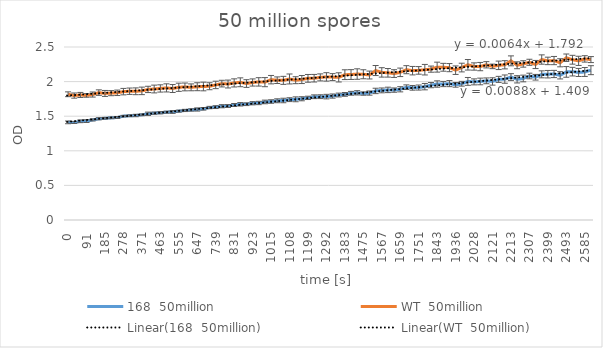
| Category | 168  50million | WT  50million |
|---|---|---|
| 0.0 | 1.411 | 1.817 |
| 30.0 | 1.41 | 1.798 |
| 61.0 | 1.426 | 1.807 |
| 91.0 | 1.429 | 1.8 |
| 122.0 | 1.446 | 1.813 |
| 153.0 | 1.463 | 1.841 |
| 185.0 | 1.47 | 1.829 |
| 216.0 | 1.476 | 1.833 |
| 246.0 | 1.481 | 1.838 |
| 278.0 | 1.501 | 1.855 |
| 309.0 | 1.506 | 1.861 |
| 341.0 | 1.51 | 1.86 |
| 371.0 | 1.52 | 1.866 |
| 402.0 | 1.535 | 1.887 |
| 432.0 | 1.544 | 1.893 |
| 463.0 | 1.55 | 1.901 |
| 494.0 | 1.558 | 1.909 |
| 525.0 | 1.561 | 1.9 |
| 555.0 | 1.573 | 1.918 |
| 586.0 | 1.583 | 1.923 |
| 617.0 | 1.59 | 1.917 |
| 647.0 | 1.597 | 1.926 |
| 678.0 | 1.607 | 1.929 |
| 708.0 | 1.625 | 1.933 |
| 739.0 | 1.631 | 1.952 |
| 770.0 | 1.644 | 1.971 |
| 800.0 | 1.647 | 1.965 |
| 831.0 | 1.662 | 1.981 |
| 862.0 | 1.672 | 1.99 |
| 893.0 | 1.673 | 1.972 |
| 923.0 | 1.687 | 1.987 |
| 954.0 | 1.691 | 1.996 |
| 985.0 | 1.706 | 1.992 |
| 1015.0 | 1.712 | 2.028 |
| 1046.0 | 1.723 | 2.02 |
| 1076.0 | 1.727 | 2.018 |
| 1108.0 | 1.739 | 2.038 |
| 1139.0 | 1.744 | 2.02 |
| 1169.0 | 1.752 | 2.03 |
| 1199.0 | 1.765 | 2.047 |
| 1230.0 | 1.781 | 2.049 |
| 1261.0 | 1.782 | 2.061 |
| 1292.0 | 1.783 | 2.068 |
| 1323.0 | 1.791 | 2.065 |
| 1353.0 | 1.806 | 2.061 |
| 1383.0 | 1.815 | 2.1 |
| 1414.0 | 1.831 | 2.102 |
| 1444.0 | 1.838 | 2.109 |
| 1475.0 | 1.827 | 2.106 |
| 1505.0 | 1.834 | 2.095 |
| 1536.0 | 1.865 | 2.16 |
| 1567.0 | 1.873 | 2.133 |
| 1598.0 | 1.88 | 2.127 |
| 1629.0 | 1.877 | 2.116 |
| 1659.0 | 1.889 | 2.134 |
| 1690.0 | 1.919 | 2.172 |
| 1720.0 | 1.91 | 2.158 |
| 1751.0 | 1.914 | 2.162 |
| 1782.0 | 1.927 | 2.172 |
| 1813.0 | 1.949 | 2.18 |
| 1843.0 | 1.965 | 2.209 |
| 1874.0 | 1.965 | 2.207 |
| 1905.0 | 1.971 | 2.202 |
| 1936.0 | 1.953 | 2.165 |
| 1967.0 | 1.969 | 2.203 |
| 1997.0 | 2.003 | 2.243 |
| 2028.0 | 1.996 | 2.218 |
| 2059.0 | 2.002 | 2.217 |
| 2090.0 | 2.011 | 2.243 |
| 2121.0 | 2.002 | 2.22 |
| 2151.0 | 2.032 | 2.235 |
| 2182.0 | 2.036 | 2.243 |
| 2213.0 | 2.066 | 2.3 |
| 2244.0 | 2.033 | 2.236 |
| 2276.0 | 2.045 | 2.255 |
| 2307.0 | 2.081 | 2.279 |
| 2337.0 | 2.063 | 2.247 |
| 2368.0 | 2.105 | 2.319 |
| 2399.0 | 2.107 | 2.299 |
| 2431.0 | 2.11 | 2.304 |
| 2462.0 | 2.091 | 2.272 |
| 2493.0 | 2.14 | 2.345 |
| 2523.0 | 2.144 | 2.316 |
| 2554.0 | 2.132 | 2.3 |
| 2585.0 | 2.139 | 2.328 |
| 2616.0 | 2.165 | 2.318 |